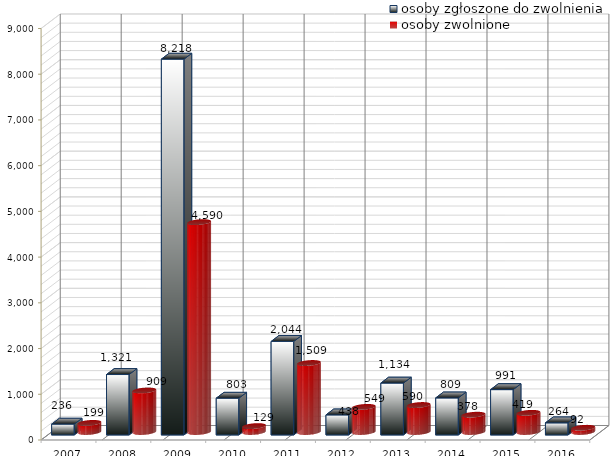
| Category | osoby zgłoszone do zwolnienia | osoby zwolnione |
|---|---|---|
| 2007.0 | 236 | 199 |
| 2008.0 | 1321 | 909 |
| 2009.0 | 8218 | 4590 |
| 2010.0 | 803 | 129 |
| 2011.0 | 2044 | 1509 |
| 2012.0 | 438 | 549 |
| 2013.0 | 1134 | 590 |
| 2014.0 | 809 | 378 |
| 2015.0 | 991 | 419 |
| 2016.0 | 264 | 92 |